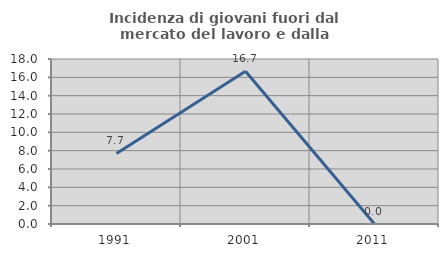
| Category | Incidenza di giovani fuori dal mercato del lavoro e dalla formazione  |
|---|---|
| 1991.0 | 7.692 |
| 2001.0 | 16.667 |
| 2011.0 | 0 |